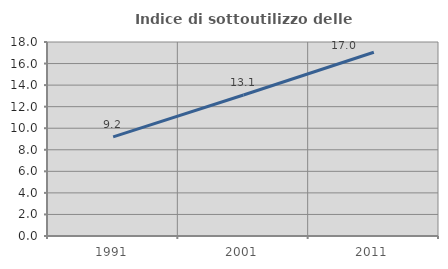
| Category | Indice di sottoutilizzo delle abitazioni  |
|---|---|
| 1991.0 | 9.201 |
| 2001.0 | 13.086 |
| 2011.0 | 17.045 |